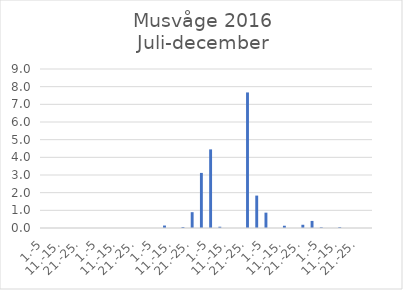
| Category | Series 0 |
|---|---|
| 1.-5 | 0 |
| 6.-10. | 0 |
| 11.-15. | 0 |
| 16.-20. | 0 |
| 21.-25. | 0 |
| 26.-31. | 0 |
| 1.-5 | 0 |
| 6.-10. | 0 |
| 11.-15. | 0 |
| 16.-20. | 0 |
| 21.-25. | 0 |
| 26.-31. | 0 |
| 1.-5 | 0 |
| 6.-10. | 0.139 |
| 11.-15. | 0 |
| 16.-20. | 0.056 |
| 21.-25. | 0.896 |
| 26.-30. | 3.118 |
| 1.-5 | 4.45 |
| 6.-10. | 0.072 |
| 11.-15. | 0 |
| 16.-20. | 0 |
| 21.-25. | 7.673 |
| 26.-31. | 1.834 |
| 1.-5 | 0.869 |
| 6.-10. | 0 |
| 11.-15. | 0.128 |
| 16.-20. | 0 |
| 21.-25. | 0.183 |
| 26.-30. | 0.4 |
| 1.-5 | 0.04 |
| 6.-10. | 0 |
| 11.-15. | 0.048 |
| 16.-20. | 0 |
| 21.-25. | 0 |
| 26.-31. | 0 |